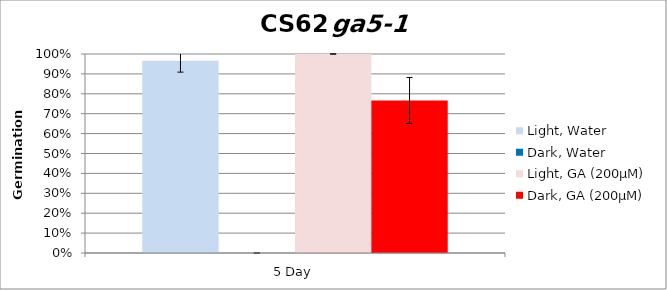
| Category | Light, Water | Dark, Water | Light, GA (200µM) | Dark, GA (200µM) |
|---|---|---|---|---|
| 5 Day | 0.967 | 0 | 1 | 0.767 |